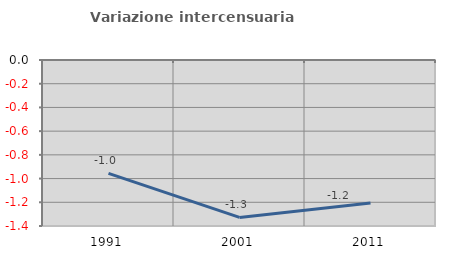
| Category | Variazione intercensuaria annua |
|---|---|
| 1991.0 | -0.956 |
| 2001.0 | -1.328 |
| 2011.0 | -1.205 |